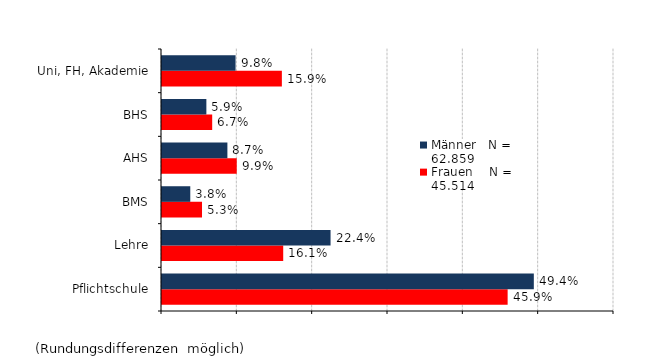
| Category | Frauen    N = 45.514 | Männer   N = 62.859 |
|---|---|---|
| Pflichtschule | 0.459 | 0.494 |
| Lehre | 0.161 | 0.224 |
| BMS | 0.053 | 0.038 |
| AHS | 0.099 | 0.087 |
| BHS | 0.067 | 0.059 |
| Uni, FH, Akademie | 0.159 | 0.098 |